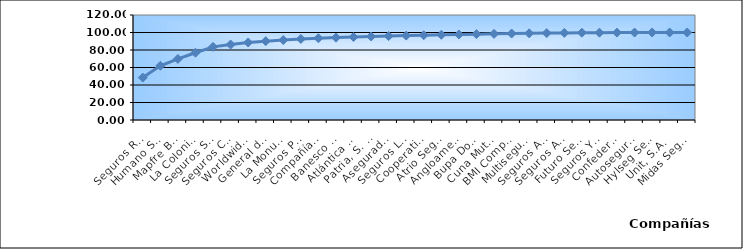
| Category | Series 0 |
|---|---|
| Seguros Reservas, S. A. | 48.5 |
| Humano Seguros, S. A. | 61.985 |
| Mapfre BHD Compañía de Seguros | 69.817 |
| La Colonial, S. A., Compañia De Seguros | 76.891 |
| Seguros Sura, S.A. | 83.588 |
| Seguros Crecer, S. A. | 86.261 |
| Worldwide Seguros, S. A. | 88.575 |
| General de Seguros, S. A. | 90.085 |
| La Monumental de Seguros, S. A. | 91.374 |
| Seguros Pepín, S. A. | 92.645 |
| Compañía Dominicana de Seguros, C. por A. | 93.457 |
| Banesco Seguros | 94.166 |
| Atlántica Seguros, S. A. | 94.821 |
| Patria, S. A., Compañía de Seguros | 95.444 |
| Aseguradora Agropecuaria Dominicana, S. A. | 95.959 |
| Seguros La Internacional, S. A. | 96.467 |
| Cooperativa Nacional De Seguros, Inc  | 96.94 |
| Atrio Seguros S. A. | 97.378 |
| Angloamericana de Seguros, S. A. | 97.763 |
| Bupa Dominicana, S. A. | 98.113 |
| Cuna Mutual Insurance Society Dominicana | 98.454 |
| BMI Compañía de Seguros, S. A. | 98.788 |
| Multiseguros Su, S.A. | 99.088 |
| Seguros APS, S.R.L. | 99.347 |
| Seguros Ademi, S.A. | 99.534 |
| Futuro Seguros | 99.719 |
| Seguros Yunen, S.A. | 99.821 |
| Confederación del Canadá Dominicana, S. A. | 99.905 |
| Autoseguro, S. A. | 99.961 |
| Hylseg Seguros S.A | 99.985 |
| Unit, S.A. | 100 |
| Midas Seguros, S.A. | 100 |